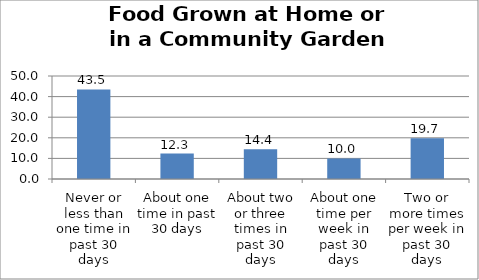
| Category | Series 0 |
|---|---|
| Never or less than one time in past 30 days | 43.472 |
| About one time in past 30 days | 12.345 |
| About two or three times in past 30 days | 14.442 |
| About one time per week in past 30 days | 10.004 |
| Two or more times per week in past 30 days | 19.738 |